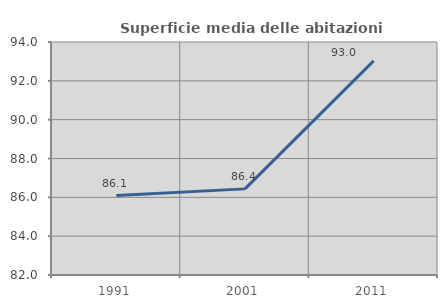
| Category | Superficie media delle abitazioni occupate |
|---|---|
| 1991.0 | 86.092 |
| 2001.0 | 86.436 |
| 2011.0 | 93.031 |